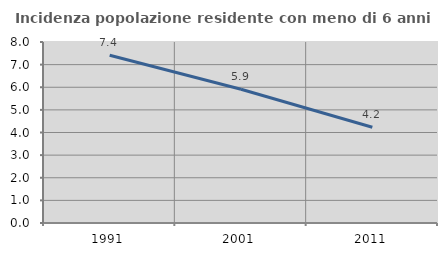
| Category | Incidenza popolazione residente con meno di 6 anni |
|---|---|
| 1991.0 | 7.414 |
| 2001.0 | 5.909 |
| 2011.0 | 4.235 |